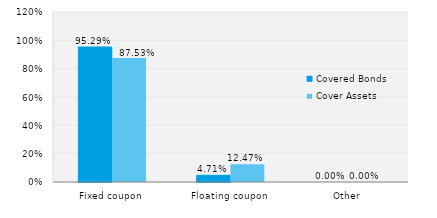
| Category | Covered Bonds | Cover Assets |
|---|---|---|
| Fixed coupon | 0.953 | 0.875 |
| Floating coupon | 0.047 | 0.125 |
| Other | 0 | 0 |